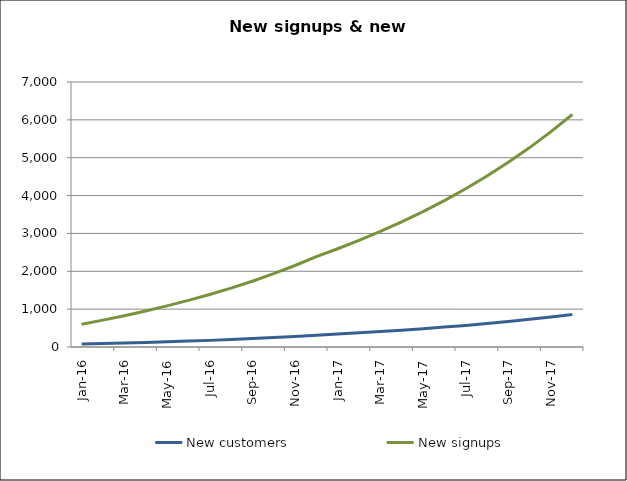
| Category | New customers | New signups |
|---|---|---|
| 2016-01-01 | 76 | 600 |
| 2016-02-01 | 90 | 710 |
| 2016-03-01 | 104 | 827.2 |
| 2016-04-01 | 120 | 952.464 |
| 2016-05-01 | 137 | 1086.76 |
| 2016-06-01 | 157 | 1231.171 |
| 2016-07-01 | 175 | 1386.911 |
| 2016-08-01 | 198 | 1555.341 |
| 2016-09-01 | 223 | 1737.982 |
| 2016-10-01 | 248 | 1936.539 |
| 2016-11-01 | 277 | 2152.924 |
| 2016-12-01 | 308 | 2389.275 |
| 2017-01-01 | 341 | 2595.81 |
| 2017-02-01 | 375 | 2816.433 |
| 2017-03-01 | 408 | 3052.412 |
| 2017-04-01 | 444 | 3305.129 |
| 2017-05-01 | 483 | 3576.09 |
| 2017-06-01 | 526 | 3866.938 |
| 2017-07-01 | 571 | 4179.463 |
| 2017-08-01 | 620 | 4515.614 |
| 2017-09-01 | 674 | 4877.52 |
| 2017-10-01 | 730 | 5267.496 |
| 2017-11-01 | 791 | 5688.071 |
| 2017-12-01 | 858 | 6141.998 |